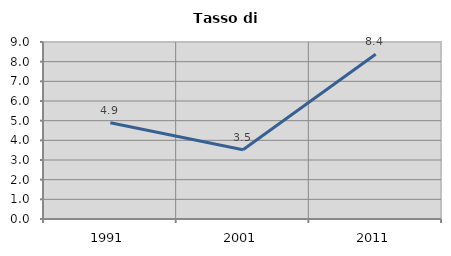
| Category | Tasso di disoccupazione   |
|---|---|
| 1991.0 | 4.898 |
| 2001.0 | 3.523 |
| 2011.0 | 8.377 |